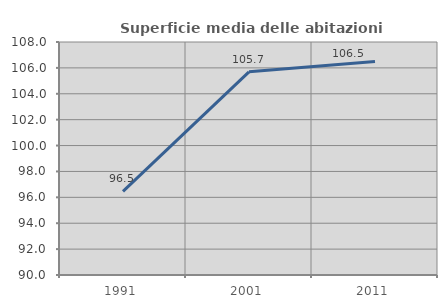
| Category | Superficie media delle abitazioni occupate |
|---|---|
| 1991.0 | 96.457 |
| 2001.0 | 105.696 |
| 2011.0 | 106.492 |